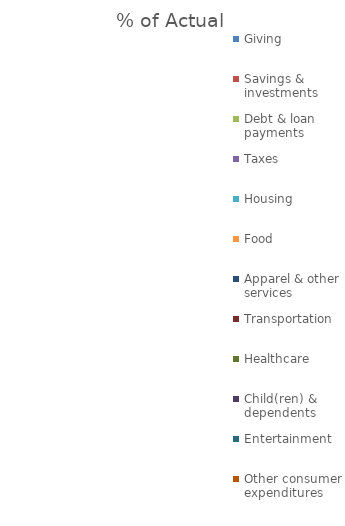
| Category | % of Actual |
|---|---|
| Giving | 0 |
| Savings & investments | 0 |
| Debt & loan payments | 0 |
| Taxes | 0 |
| Housing | 0 |
| Food | 0 |
| Apparel & other services | 0 |
| Transportation | 0 |
| Healthcare | 0 |
| Child(ren) & dependents | 0 |
| Entertainment | 0 |
| Other consumer expenditures | 0 |